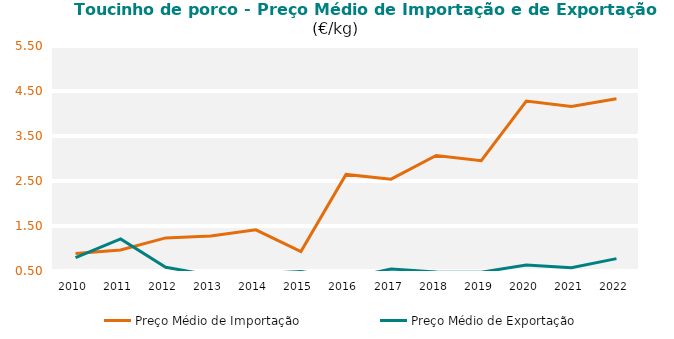
| Category | Preço Médio de Importação | Preço Médio de Exportação |
|---|---|---|
| 2010.0 | 0.889 | 0.795 |
| 2011.0 | 0.969 | 1.214 |
| 2012.0 | 1.236 | 0.584 |
| 2013.0 | 1.28 | 0.405 |
| 2014.0 | 1.414 | 0.436 |
| 2015.0 | 0.931 | 0.489 |
| 2016.0 | 2.646 | 0.33 |
| 2017.0 | 2.541 | 0.545 |
| 2018.0 | 3.066 | 0.478 |
| 2019.0 | 2.952 | 0.473 |
| 2020.0 | 4.275 | 0.635 |
| 2021.0 | 4.157 | 0.573 |
| 2022.0 | 4.326 | 0.775 |